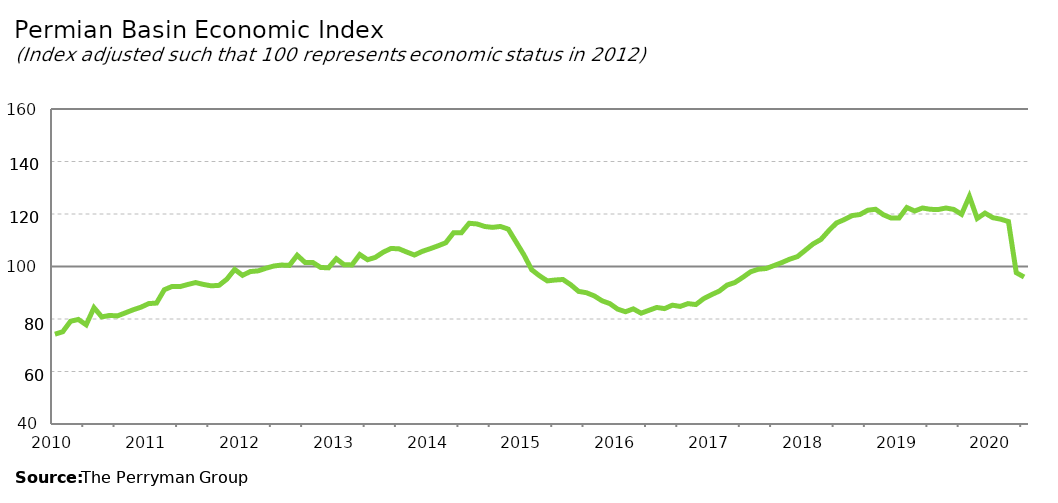
| Category | Permian Basin Composite |
|---|---|
| 2010-01-31 | 74.223 |
| 2010-02-28 | 75.14 |
| 2010-03-31 | 79.135 |
| 2010-04-30 | 79.83 |
| 2010-05-31 | 77.791 |
| 2010-06-30 | 84.311 |
| 2010-07-31 | 80.805 |
| 2010-08-31 | 81.357 |
| 2010-09-30 | 81.177 |
| 2010-10-31 | 82.322 |
| 2010-11-30 | 83.496 |
| 2010-12-31 | 84.486 |
| 2011-01-31 | 85.866 |
| 2011-02-28 | 86.068 |
| 2011-03-31 | 91.147 |
| 2011-04-30 | 92.413 |
| 2011-05-31 | 92.333 |
| 2011-06-30 | 93.154 |
| 2011-07-31 | 93.884 |
| 2011-08-31 | 93.171 |
| 2011-09-30 | 92.641 |
| 2011-10-31 | 92.815 |
| 2011-11-30 | 95.177 |
| 2011-12-31 | 98.871 |
| 2012-01-31 | 96.638 |
| 2012-02-29 | 98.073 |
| 2012-03-31 | 98.341 |
| 2012-04-30 | 99.345 |
| 2012-05-31 | 100.177 |
| 2012-06-30 | 100.557 |
| 2012-07-31 | 100.419 |
| 2012-08-31 | 104.279 |
| 2012-09-30 | 101.553 |
| 2012-10-31 | 101.527 |
| 2012-11-30 | 99.639 |
| 2012-12-31 | 99.483 |
| 2013-01-31 | 102.967 |
| 2013-02-28 | 100.671 |
| 2013-03-31 | 100.603 |
| 2013-04-30 | 104.56 |
| 2013-05-31 | 102.578 |
| 2013-06-30 | 103.478 |
| 2013-07-31 | 105.45 |
| 2013-08-31 | 106.86 |
| 2013-09-30 | 106.753 |
| 2013-10-31 | 105.522 |
| 2013-11-30 | 104.367 |
| 2013-12-31 | 105.762 |
| 2014-01-31 | 106.773 |
| 2014-02-28 | 107.852 |
| 2014-03-31 | 109.028 |
| 2014-04-30 | 112.823 |
| 2014-05-31 | 112.822 |
| 2014-06-30 | 116.47 |
| 2014-07-31 | 116.207 |
| 2014-08-31 | 115.238 |
| 2014-09-30 | 114.908 |
| 2014-10-31 | 115.26 |
| 2014-11-30 | 114.233 |
| 2014-12-31 | 109.354 |
| 2015-01-31 | 104.467 |
| 2015-02-28 | 98.767 |
| 2015-03-31 | 96.47 |
| 2015-04-30 | 94.518 |
| 2015-05-31 | 94.855 |
| 2015-06-30 | 95.05 |
| 2015-07-31 | 93.038 |
| 2015-08-31 | 90.523 |
| 2015-09-30 | 90.012 |
| 2015-10-31 | 88.812 |
| 2015-11-30 | 86.94 |
| 2015-12-31 | 85.857 |
| 2016-01-31 | 83.748 |
| 2016-02-29 | 82.761 |
| 2016-03-31 | 83.859 |
| 2016-04-30 | 82.212 |
| 2016-05-31 | 83.306 |
| 2016-06-30 | 84.396 |
| 2016-07-31 | 83.957 |
| 2016-08-31 | 85.264 |
| 2016-09-30 | 84.797 |
| 2016-10-31 | 85.856 |
| 2016-11-30 | 85.501 |
| 2016-12-31 | 87.743 |
| 2017-01-31 | 89.266 |
| 2017-02-28 | 90.624 |
| 2017-03-31 | 92.916 |
| 2017-04-30 | 93.908 |
| 2017-05-31 | 95.851 |
| 2017-06-30 | 97.961 |
| 2017-07-31 | 98.963 |
| 2017-08-31 | 99.237 |
| 2017-09-30 | 100.352 |
| 2017-10-31 | 101.486 |
| 2017-11-30 | 102.78 |
| 2017-12-31 | 103.771 |
| 2018-01-31 | 106.177 |
| 2018-02-28 | 108.592 |
| 2018-03-31 | 110.282 |
| 2018-04-30 | 113.612 |
| 2018-05-31 | 116.583 |
| 2018-06-30 | 117.876 |
| 2018-07-31 | 119.393 |
| 2018-08-31 | 119.807 |
| 2018-09-30 | 121.431 |
| 2018-10-31 | 121.807 |
| 2018-11-30 | 119.715 |
| 2018-12-31 | 118.444 |
| 2019-01-31 | 118.452 |
| 2019-02-28 | 122.464 |
| 2019-03-31 | 121.135 |
| 2019-04-30 | 122.287 |
| 2019-05-31 | 121.788 |
| 2019-06-30 | 121.687 |
| 2019-07-31 | 122.279 |
| 2019-08-31 | 121.747 |
| 2019-09-30 | 119.887 |
| 2019-10-31 | 126.724 |
| 2019-11-30 | 118.304 |
| 2019-12-31 | 120.34 |
| 2020-01-31 | 118.597 |
| 2020-02-29 | 118.024 |
| 2020-03-31 | 117.126 |
| 2020-04-30 | 97.642 |
| 2020-05-31 | 95.994 |